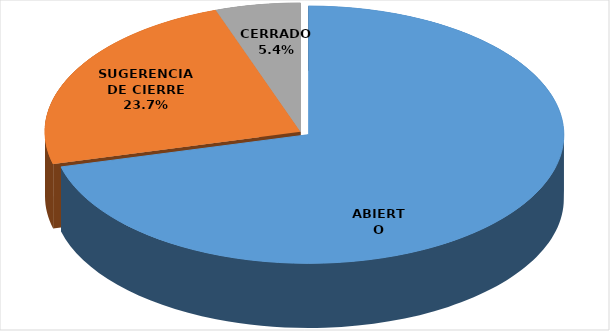
| Category | Series 0 |
|---|---|
| ABIERTO | 66 |
| SUGERENCIA DE CIERRE | 22 |
| CERRADO | 5 |